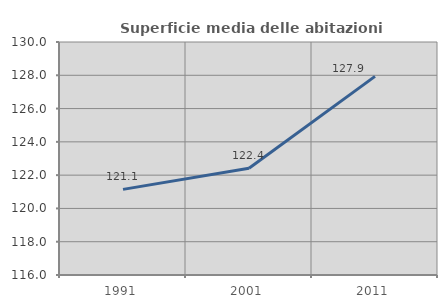
| Category | Superficie media delle abitazioni occupate |
|---|---|
| 1991.0 | 121.145 |
| 2001.0 | 122.41 |
| 2011.0 | 127.933 |